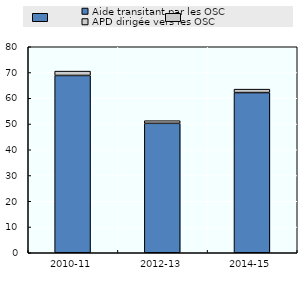
| Category | Aide transitant par les OSC | APD dirigée vers les OSC |
|---|---|---|
| 0 | 68.856 | 1.687 |
| 1 | 50.269 | 1.031 |
| 2 | 62.204 | 1.337 |